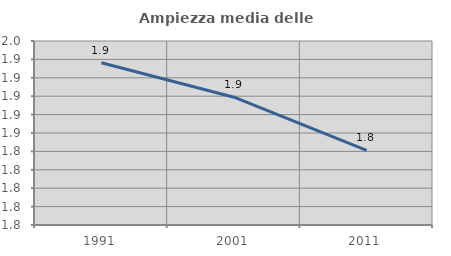
| Category | Ampiezza media delle famiglie |
|---|---|
| 1991.0 | 1.926 |
| 2001.0 | 1.889 |
| 2011.0 | 1.831 |